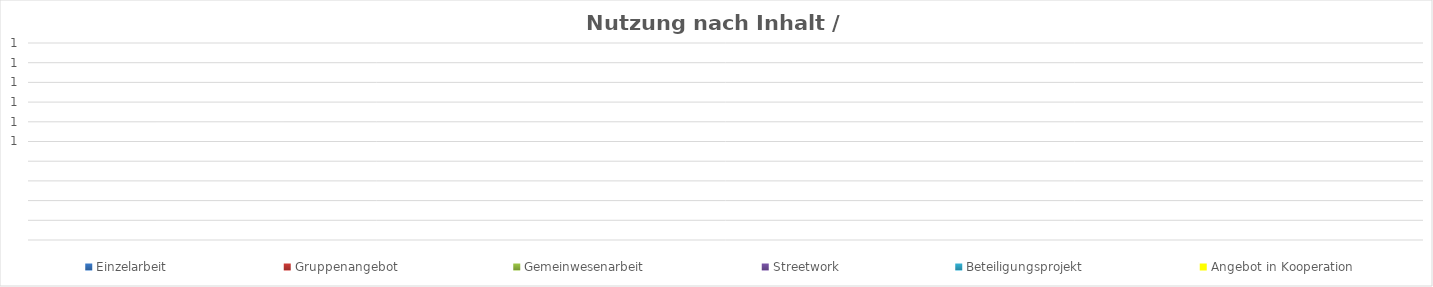
| Category | Einzelarbeit | Gruppenangebot | Gemeinwesenarbeit | Streetwork | Beteiligungsprojekt | Angebot in Kooperation |
|---|---|---|---|---|---|---|
| 0 | 0 | 0 | 0 | 0 | 0 | 0 |